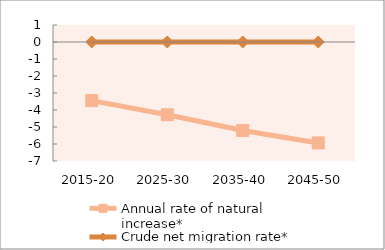
| Category | Annual rate of natural increase* | Crude net migration rate* |
|---|---|---|
| 2015-20 | -3.449 | 0.001 |
| 2025-30 | -4.28 | 0.001 |
| 2035-40 | -5.204 | 0.001 |
| 2045-50 | -5.936 | 0.001 |